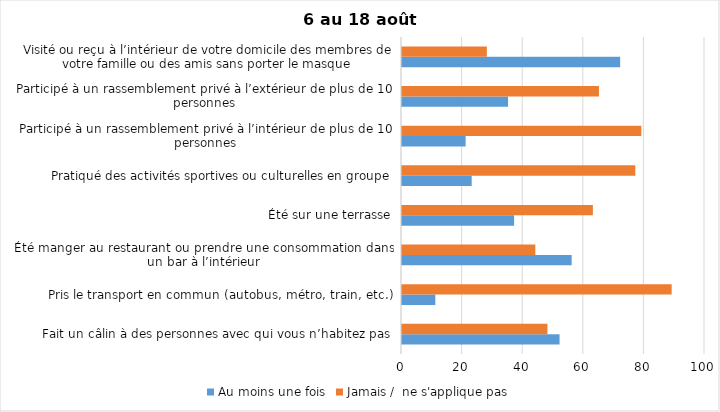
| Category | Au moins une fois | Jamais /  ne s'applique pas |
|---|---|---|
| Fait un câlin à des personnes avec qui vous n’habitez pas | 52 | 48 |
| Pris le transport en commun (autobus, métro, train, etc.) | 11 | 89 |
| Été manger au restaurant ou prendre une consommation dans un bar à l’intérieur | 56 | 44 |
| Été sur une terrasse | 37 | 63 |
| Pratiqué des activités sportives ou culturelles en groupe | 23 | 77 |
| Participé à un rassemblement privé à l’intérieur de plus de 10 personnes | 21 | 79 |
| Participé à un rassemblement privé à l’extérieur de plus de 10 personnes | 35 | 65 |
| Visité ou reçu à l’intérieur de votre domicile des membres de votre famille ou des amis sans porter le masque | 72 | 28 |